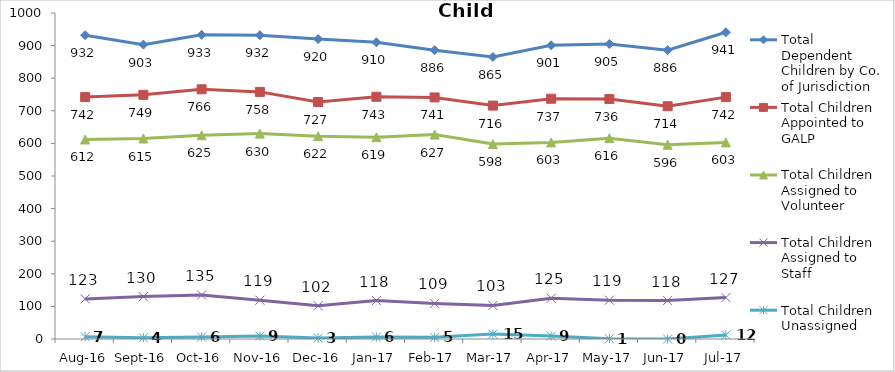
| Category | Total Dependent Children by Co. of Jurisdiction | Total Children Appointed to GALP | Total Children Assigned to Volunteer | Total Children Assigned to Staff | Total Children Unassigned |
|---|---|---|---|---|---|
| Aug-16 | 932 | 742 | 612 | 123 | 7 |
| Sep-16 | 903 | 749 | 615 | 130 | 4 |
| Oct-16 | 933 | 766 | 625 | 135 | 6 |
| Nov-16 | 932 | 758 | 630 | 119 | 9 |
| Dec-16 | 920 | 727 | 622 | 102 | 3 |
| Jan-17 | 910 | 743 | 619 | 118 | 6 |
| Feb-17 | 886 | 741 | 627 | 109 | 5 |
| Mar-17 | 865 | 716 | 598 | 103 | 15 |
| Apr-17 | 901 | 737 | 603 | 125 | 9 |
| May-17 | 905 | 736 | 616 | 119 | 1 |
| Jun-17 | 886 | 714 | 596 | 118 | 0 |
| Jul-17 | 941 | 742 | 603 | 127 | 12 |